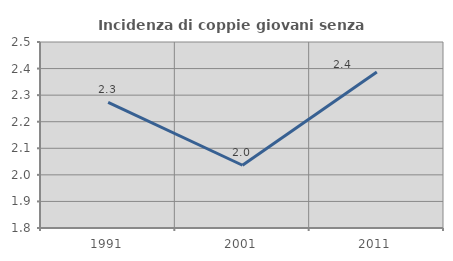
| Category | Incidenza di coppie giovani senza figli |
|---|---|
| 1991.0 | 2.273 |
| 2001.0 | 2.036 |
| 2011.0 | 2.387 |